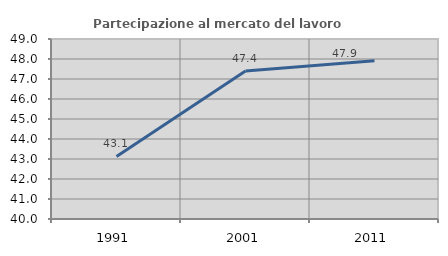
| Category | Partecipazione al mercato del lavoro  femminile |
|---|---|
| 1991.0 | 43.126 |
| 2001.0 | 47.406 |
| 2011.0 | 47.916 |